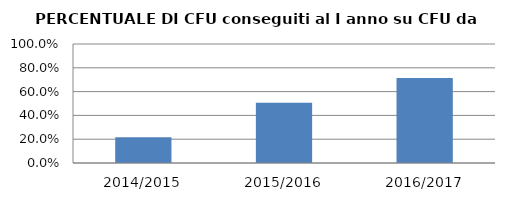
| Category | 2014/2015 2015/2016 2016/2017 |
|---|---|
| 2014/2015 | 0.215 |
| 2015/2016 | 0.506 |
| 2016/2017 | 0.715 |